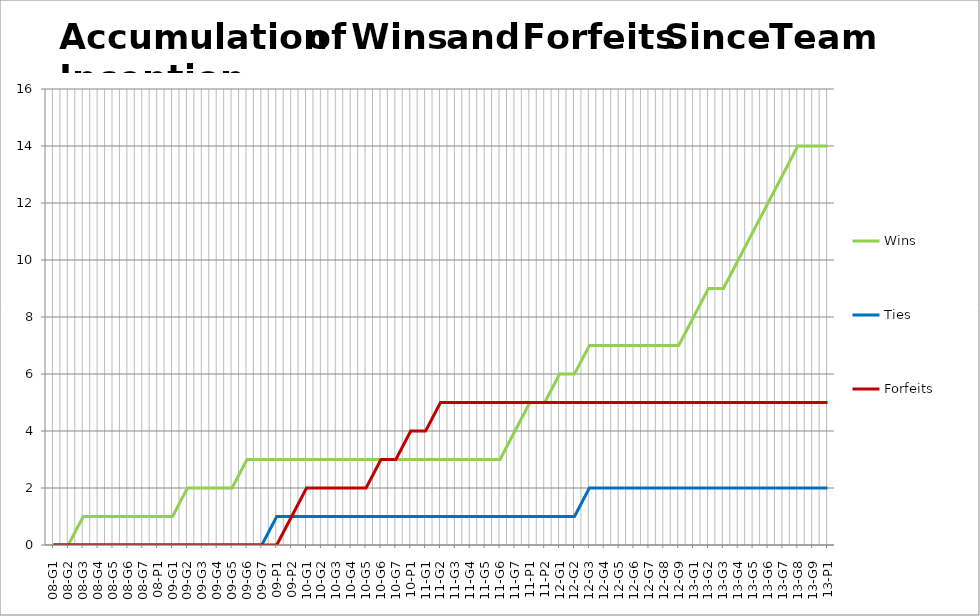
| Category | Wins | Ties | Forfeits |
|---|---|---|---|
| 08-G1 | 0 | 0 | 0 |
| 08-G2 | 0 | 0 | 0 |
| 08-G3 | 1 | 0 | 0 |
| 08-G4 | 1 | 0 | 0 |
| 08-G5 | 1 | 0 | 0 |
| 08-G6 | 1 | 0 | 0 |
| 08-G7 | 1 | 0 | 0 |
| 08-P1 | 1 | 0 | 0 |
| 09-G1 | 1 | 0 | 0 |
| 09-G2 | 2 | 0 | 0 |
| 09-G3 | 2 | 0 | 0 |
| 09-G4 | 2 | 0 | 0 |
| 09-G5 | 2 | 0 | 0 |
| 09-G6 | 3 | 0 | 0 |
| 09-G7 | 3 | 0 | 0 |
| 09-P1 | 3 | 1 | 0 |
| 09-P2 | 3 | 1 | 1 |
| 10-G1 | 3 | 1 | 2 |
| 10-G2 | 3 | 1 | 2 |
| 10-G3 | 3 | 1 | 2 |
| 10-G4 | 3 | 1 | 2 |
| 10-G5 | 3 | 1 | 2 |
| 10-G6 | 3 | 1 | 3 |
| 10-G7 | 3 | 1 | 3 |
| 10-P1 | 3 | 1 | 4 |
| 11-G1 | 3 | 1 | 4 |
| 11-G2 | 3 | 1 | 5 |
| 11-G3 | 3 | 1 | 5 |
| 11-G4 | 3 | 1 | 5 |
| 11-G5 | 3 | 1 | 5 |
| 11-G6 | 3 | 1 | 5 |
| 11-G7 | 4 | 1 | 5 |
| 11-P1 | 5 | 1 | 5 |
| 11-P2 | 5 | 1 | 5 |
| 12-G1 | 6 | 1 | 5 |
| 12-G2 | 6 | 1 | 5 |
| 12-G3 | 7 | 2 | 5 |
| 12-G4 | 7 | 2 | 5 |
| 12-G5 | 7 | 2 | 5 |
| 12-G6 | 7 | 2 | 5 |
| 12-G7 | 7 | 2 | 5 |
| 12-G8 | 7 | 2 | 5 |
| 12-G9 | 7 | 2 | 5 |
| 13-G1 | 8 | 2 | 5 |
| 13-G2 | 9 | 2 | 5 |
| 13-G3 | 9 | 2 | 5 |
| 13-G4 | 10 | 2 | 5 |
| 13-G5 | 11 | 2 | 5 |
| 13-G6 | 12 | 2 | 5 |
| 13-G7 | 13 | 2 | 5 |
| 13-G8 | 14 | 2 | 5 |
| 13-G9 | 14 | 2 | 5 |
| 13-P1 | 14 | 2 | 5 |